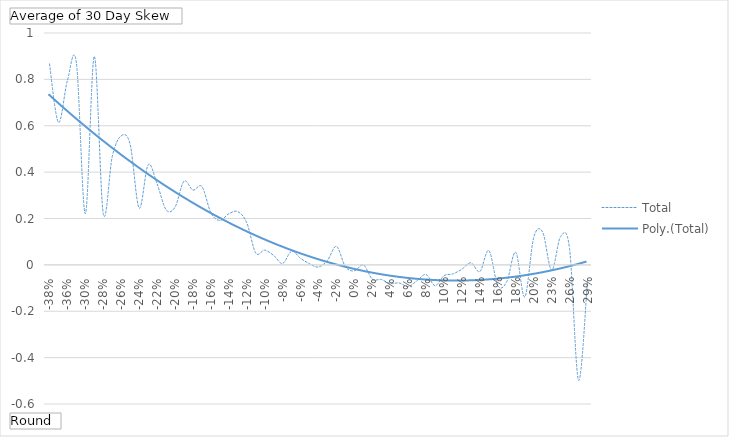
| Category | Total |
|---|---|
| -38% | 0.867 |
| -37% | 0.614 |
| -36% | 0.795 |
| -34% | 0.872 |
| -30% | 0.221 |
| -29% | 0.899 |
| -28% | 0.22 |
| -27% | 0.467 |
| -26% | 0.556 |
| -25% | 0.519 |
| -24% | 0.245 |
| -23% | 0.432 |
| -22% | 0.35 |
| -21% | 0.237 |
| -20% | 0.249 |
| -19% | 0.361 |
| -18% | 0.322 |
| -17% | 0.338 |
| -16% | 0.225 |
| -15% | 0.192 |
| -14% | 0.22 |
| -13% | 0.23 |
| -12% | 0.182 |
| -11% | 0.051 |
| -10% | 0.063 |
| -9% | 0.041 |
| -8% | 0.006 |
| -7% | 0.059 |
| -6% | 0.028 |
| -5% | 0.005 |
| -4% | -0.009 |
| -3% | 0.019 |
| -2% | 0.08 |
| -1% | -0.008 |
| 0% | -0.026 |
| 1% | 0 |
| 2% | -0.062 |
| 3% | -0.063 |
| 4% | -0.081 |
| 5% | -0.078 |
| 6% | -0.094 |
| 7% | -0.068 |
| 8% | -0.042 |
| 9% | -0.09 |
| 10% | -0.047 |
| 11% | -0.039 |
| 12% | -0.019 |
| 13% | 0.009 |
| 14% | -0.029 |
| 15% | 0.062 |
| 16% | -0.09 |
| 17% | -0.072 |
| 18% | 0.054 |
| 19% | -0.138 |
| 20% | 0.118 |
| 22% | 0.141 |
| 23% | -0.023 |
| 24% | 0.122 |
| 26% | 0.068 |
| 27% | -0.498 |
| 29% | -0.068 |